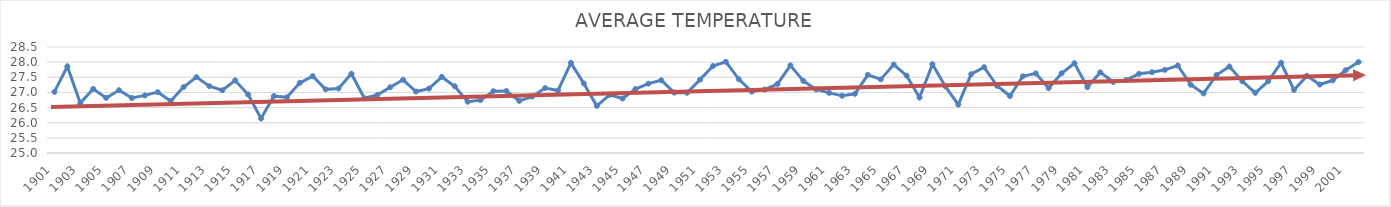
| Category | AVERAGE TEMPERATURE |
|---|---|
| 1901.0 | 27.018 |
| 1902.0 | 27.859 |
| 1903.0 | 26.649 |
| 1904.0 | 27.117 |
| 1905.0 | 26.819 |
| 1906.0 | 27.074 |
| 1907.0 | 26.816 |
| 1908.0 | 26.904 |
| 1909.0 | 27.009 |
| 1910.0 | 26.716 |
| 1911.0 | 27.177 |
| 1912.0 | 27.505 |
| 1913.0 | 27.205 |
| 1914.0 | 27.072 |
| 1915.0 | 27.397 |
| 1916.0 | 26.93 |
| 1917.0 | 26.139 |
| 1918.0 | 26.88 |
| 1919.0 | 26.838 |
| 1920.0 | 27.317 |
| 1921.0 | 27.536 |
| 1922.0 | 27.102 |
| 1923.0 | 27.13 |
| 1924.0 | 27.618 |
| 1925.0 | 26.808 |
| 1926.0 | 26.915 |
| 1927.0 | 27.171 |
| 1928.0 | 27.417 |
| 1929.0 | 27.03 |
| 1930.0 | 27.124 |
| 1931.0 | 27.512 |
| 1932.0 | 27.203 |
| 1933.0 | 26.693 |
| 1934.0 | 26.745 |
| 1935.0 | 27.043 |
| 1936.0 | 27.047 |
| 1937.0 | 26.721 |
| 1938.0 | 26.863 |
| 1939.0 | 27.144 |
| 1940.0 | 27.063 |
| 1941.0 | 27.976 |
| 1942.0 | 27.296 |
| 1943.0 | 26.557 |
| 1944.0 | 26.917 |
| 1945.0 | 26.798 |
| 1946.0 | 27.112 |
| 1947.0 | 27.29 |
| 1948.0 | 27.401 |
| 1949.0 | 26.992 |
| 1950.0 | 26.988 |
| 1951.0 | 27.423 |
| 1952.0 | 27.872 |
| 1953.0 | 28.011 |
| 1954.0 | 27.439 |
| 1955.0 | 27.026 |
| 1956.0 | 27.096 |
| 1957.0 | 27.281 |
| 1958.0 | 27.894 |
| 1959.0 | 27.379 |
| 1960.0 | 27.098 |
| 1961.0 | 26.986 |
| 1962.0 | 26.889 |
| 1963.0 | 26.955 |
| 1964.0 | 27.579 |
| 1965.0 | 27.431 |
| 1966.0 | 27.921 |
| 1967.0 | 27.555 |
| 1968.0 | 26.833 |
| 1969.0 | 27.931 |
| 1970.0 | 27.199 |
| 1971.0 | 26.597 |
| 1972.0 | 27.605 |
| 1973.0 | 27.833 |
| 1974.0 | 27.22 |
| 1975.0 | 26.883 |
| 1976.0 | 27.533 |
| 1977.0 | 27.63 |
| 1978.0 | 27.138 |
| 1979.0 | 27.631 |
| 1980.0 | 27.964 |
| 1981.0 | 27.173 |
| 1982.0 | 27.662 |
| 1983.0 | 27.346 |
| 1984.0 | 27.409 |
| 1985.0 | 27.615 |
| 1986.0 | 27.667 |
| 1987.0 | 27.746 |
| 1988.0 | 27.888 |
| 1989.0 | 27.256 |
| 1990.0 | 26.967 |
| 1991.0 | 27.575 |
| 1992.0 | 27.855 |
| 1993.0 | 27.369 |
| 1994.0 | 26.986 |
| 1995.0 | 27.369 |
| 1996.0 | 27.978 |
| 1997.0 | 27.083 |
| 1998.0 | 27.547 |
| 1999.0 | 27.261 |
| 2000.0 | 27.398 |
| 2001.0 | 27.734 |
| 2002.0 | 28.003 |